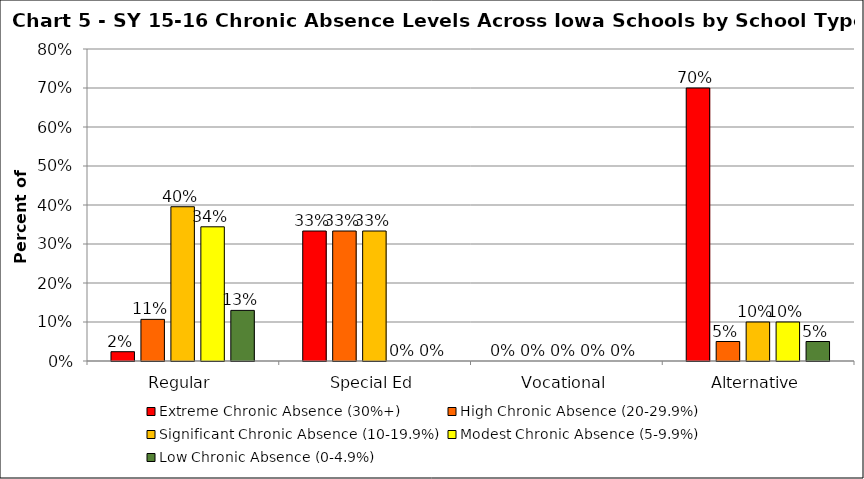
| Category | Extreme Chronic Absence (30%+) | High Chronic Absence (20-29.9%) | Significant Chronic Absence (10-19.9%) | Modest Chronic Absence (5-9.9%) | Low Chronic Absence (0-4.9%) |
|---|---|---|---|---|---|
| 0 | 0.024 | 0.107 | 0.396 | 0.344 | 0.13 |
| 1 | 0.333 | 0.333 | 0.333 | 0 | 0 |
| 2 | 0 | 0 | 0 | 0 | 0 |
| 3 | 0.7 | 0.05 | 0.1 | 0.1 | 0.05 |